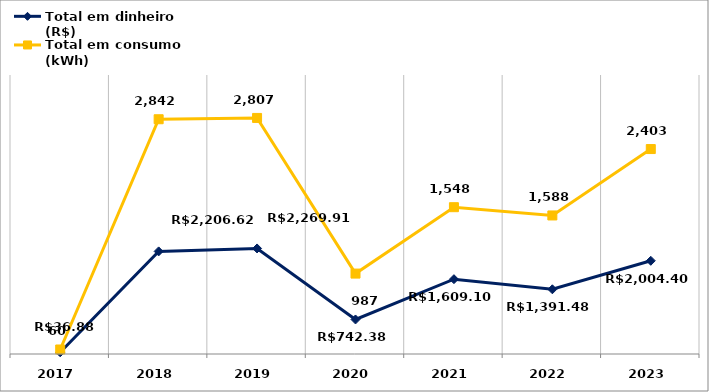
| Category | Total em dinheiro (R$) | Total em consumo (kWh) |
|---|---|---|
| 2017.0 | 36.88 | 60 |
| 2018.0 | 2206.62 | 2842 |
| 2019.0 | 2269.91 | 2807 |
| 2020.0 | 742.38 | 987 |
| 2021.0 | 1609.1 | 1548 |
| 2022.0 | 1391.48 | 1588 |
| 2023.0 | 2004.4 | 2403 |